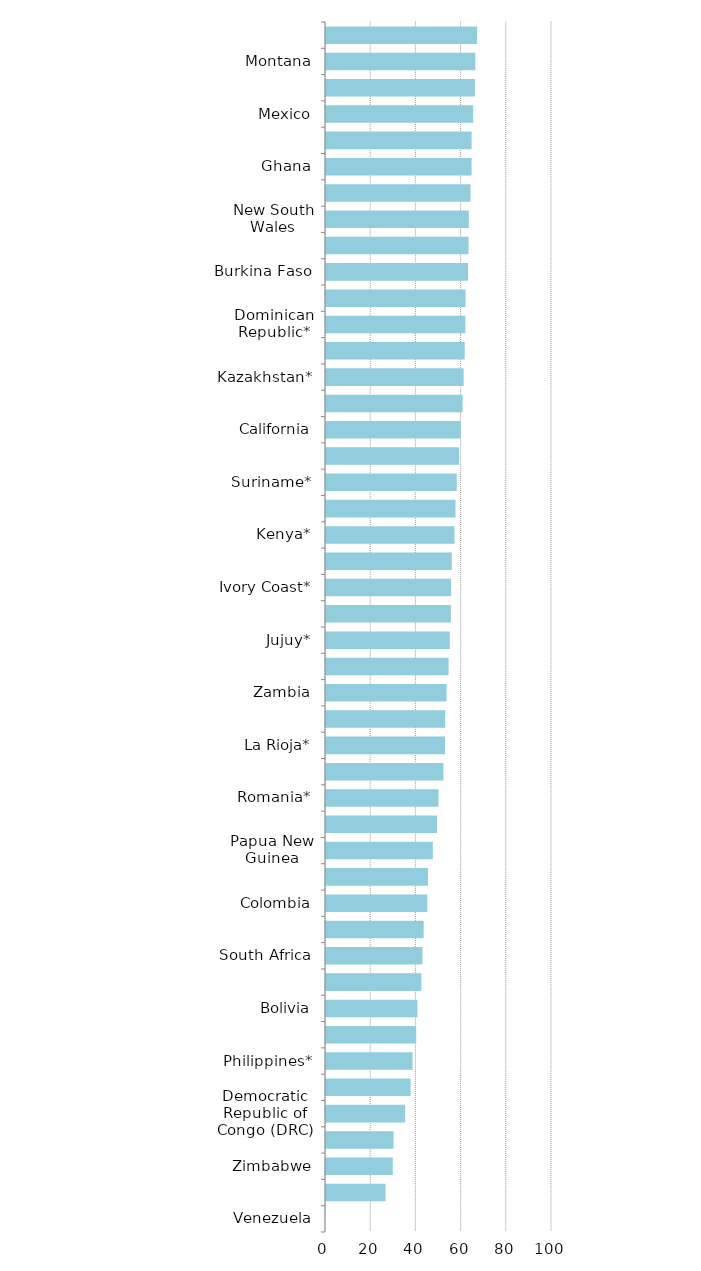
| Category | Series 0 |
|---|---|
| Venezuela | 0 |
| Chubut* | 26.338 |
| Zimbabwe | 29.541 |
| Guatemala | 29.891 |
| Democratic Republic of Congo (DRC) | 35.034 |
| China* | 37.459 |
| Philippines* | 38.292 |
| Indonesia | 39.917 |
| Bolivia | 40.454 |
| Ecuador | 42.178 |
| South Africa | 42.665 |
| Mendoza | 43.216 |
| Colombia | 44.798 |
| Tanzania | 45.114 |
| Papua New Guinea | 47.271 |
| Panama* | 49.144 |
| Romania* | 49.779 |
| Mozambique* | 51.96 |
| La Rioja* | 52.658 |
| Turkey | 52.737 |
| Zambia | 53.337 |
| Mongolia* | 54.229 |
| Jujuy* | 54.754 |
| Nicaragua* | 55.241 |
| Ivory Coast* | 55.35 |
| Brazil | 55.657 |
| Kenya* | 56.855 |
| Ethiopia* | 57.308 |
| Suriname* | 57.872 |
| French Guiana | 58.908 |
| California | 59.615 |
| Russia* | 60.436 |
| Kazakhstan* | 60.912 |
| Santa Cruz | 61.377 |
| Dominican Republic* | 61.659 |
| Guyana* | 61.761 |
| Burkina Faso | 62.843 |
| Greenland | 63.072 |
| New South Wales | 63.208 |
| Victoria | 63.932 |
| Ghana | 64.419 |
| New Zealand | 64.432 |
| Mexico | 65.127 |
| Morocco* | 65.878 |
| Montana | 66.062 |
| Mali | 66.863 |